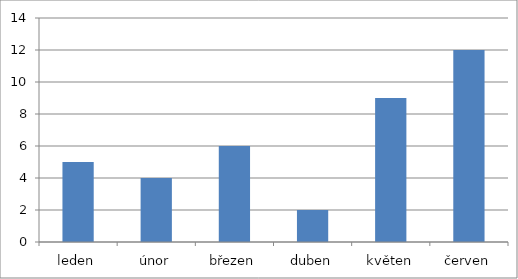
| Category | Series 0 |
|---|---|
| leden | 5 |
| únor | 4 |
| březen | 6 |
| duben | 2 |
| květen | 9 |
| červen | 12 |